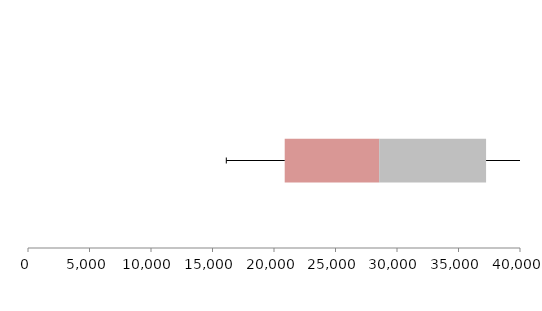
| Category | Series 1 | Series 2 | Series 3 |
|---|---|---|---|
| 0 | 20870.3 | 7679.656 | 8692.449 |